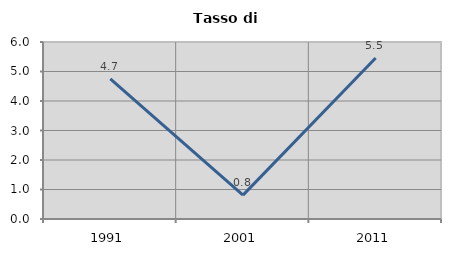
| Category | Tasso di disoccupazione   |
|---|---|
| 1991.0 | 4.748 |
| 2001.0 | 0.809 |
| 2011.0 | 5.46 |